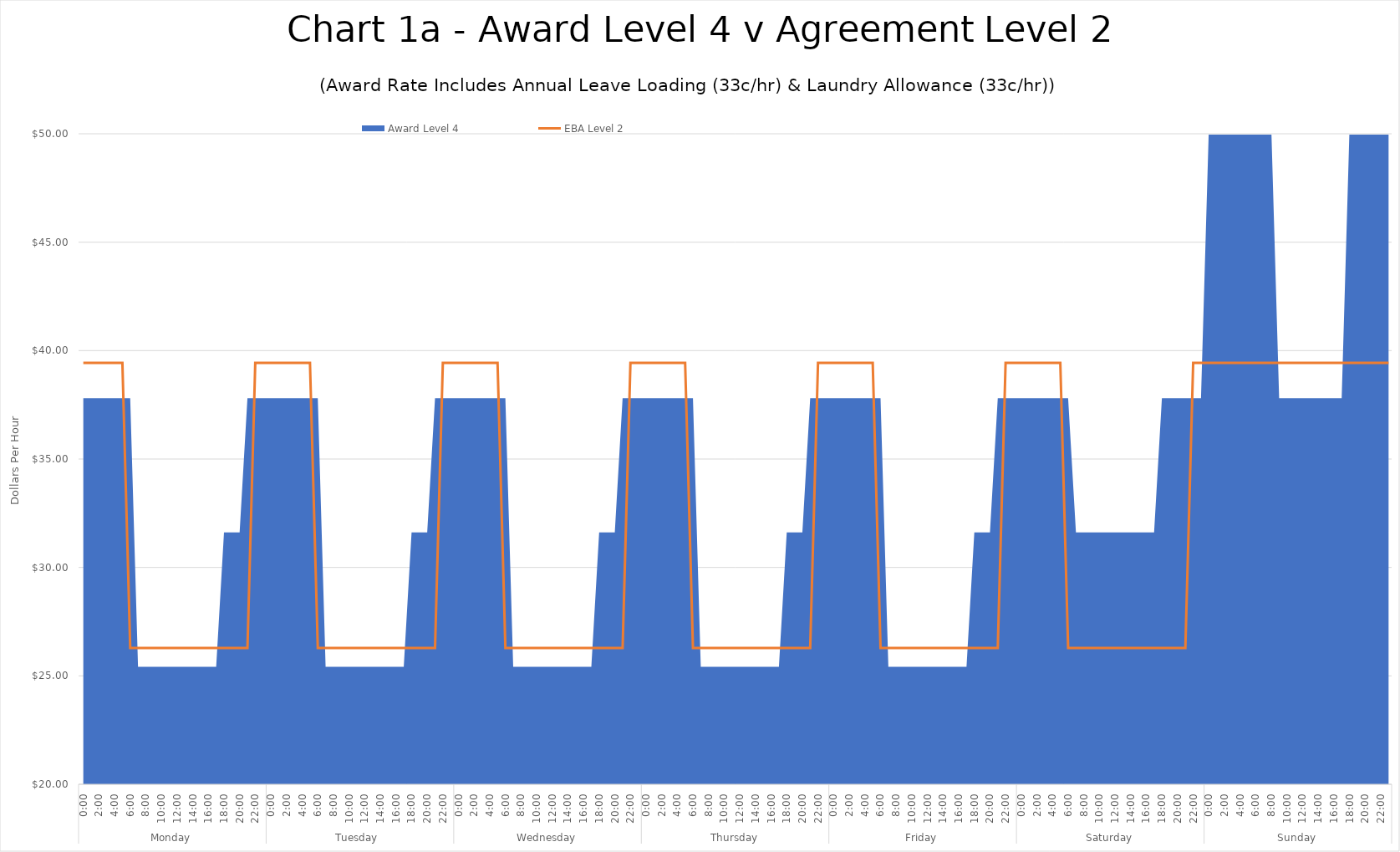
| Category | EBA Level 2 |
|---|---|
| 0 | 39.435 |
| 1 | 39.435 |
| 2 | 39.435 |
| 3 | 39.435 |
| 4 | 39.435 |
| 5 | 39.435 |
| 6 | 26.29 |
| 7 | 26.29 |
| 8 | 26.29 |
| 9 | 26.29 |
| 10 | 26.29 |
| 11 | 26.29 |
| 12 | 26.29 |
| 13 | 26.29 |
| 14 | 26.29 |
| 15 | 26.29 |
| 16 | 26.29 |
| 17 | 26.29 |
| 18 | 26.29 |
| 19 | 26.29 |
| 20 | 26.29 |
| 21 | 26.29 |
| 22 | 39.435 |
| 23 | 39.435 |
| 24 | 39.435 |
| 25 | 39.435 |
| 26 | 39.435 |
| 27 | 39.435 |
| 28 | 39.435 |
| 29 | 39.435 |
| 30 | 26.29 |
| 31 | 26.29 |
| 32 | 26.29 |
| 33 | 26.29 |
| 34 | 26.29 |
| 35 | 26.29 |
| 36 | 26.29 |
| 37 | 26.29 |
| 38 | 26.29 |
| 39 | 26.29 |
| 40 | 26.29 |
| 41 | 26.29 |
| 42 | 26.29 |
| 43 | 26.29 |
| 44 | 26.29 |
| 45 | 26.29 |
| 46 | 39.435 |
| 47 | 39.435 |
| 48 | 39.435 |
| 49 | 39.435 |
| 50 | 39.435 |
| 51 | 39.435 |
| 52 | 39.435 |
| 53 | 39.435 |
| 54 | 26.29 |
| 55 | 26.29 |
| 56 | 26.29 |
| 57 | 26.29 |
| 58 | 26.29 |
| 59 | 26.29 |
| 60 | 26.29 |
| 61 | 26.29 |
| 62 | 26.29 |
| 63 | 26.29 |
| 64 | 26.29 |
| 65 | 26.29 |
| 66 | 26.29 |
| 67 | 26.29 |
| 68 | 26.29 |
| 69 | 26.29 |
| 70 | 39.435 |
| 71 | 39.435 |
| 72 | 39.435 |
| 73 | 39.435 |
| 74 | 39.435 |
| 75 | 39.435 |
| 76 | 39.435 |
| 77 | 39.435 |
| 78 | 26.29 |
| 79 | 26.29 |
| 80 | 26.29 |
| 81 | 26.29 |
| 82 | 26.29 |
| 83 | 26.29 |
| 84 | 26.29 |
| 85 | 26.29 |
| 86 | 26.29 |
| 87 | 26.29 |
| 88 | 26.29 |
| 89 | 26.29 |
| 90 | 26.29 |
| 91 | 26.29 |
| 92 | 26.29 |
| 93 | 26.29 |
| 94 | 39.435 |
| 95 | 39.435 |
| 96 | 39.435 |
| 97 | 39.435 |
| 98 | 39.435 |
| 99 | 39.435 |
| 100 | 39.435 |
| 101 | 39.435 |
| 102 | 26.29 |
| 103 | 26.29 |
| 104 | 26.29 |
| 105 | 26.29 |
| 106 | 26.29 |
| 107 | 26.29 |
| 108 | 26.29 |
| 109 | 26.29 |
| 110 | 26.29 |
| 111 | 26.29 |
| 112 | 26.29 |
| 113 | 26.29 |
| 114 | 26.29 |
| 115 | 26.29 |
| 116 | 26.29 |
| 117 | 26.29 |
| 118 | 39.435 |
| 119 | 39.435 |
| 120 | 39.435 |
| 121 | 39.435 |
| 122 | 39.435 |
| 123 | 39.435 |
| 124 | 39.435 |
| 125 | 39.435 |
| 126 | 26.29 |
| 127 | 26.29 |
| 128 | 26.29 |
| 129 | 26.29 |
| 130 | 26.29 |
| 131 | 26.29 |
| 132 | 26.29 |
| 133 | 26.29 |
| 134 | 26.29 |
| 135 | 26.29 |
| 136 | 26.29 |
| 137 | 26.29 |
| 138 | 26.29 |
| 139 | 26.29 |
| 140 | 26.29 |
| 141 | 26.29 |
| 142 | 39.435 |
| 143 | 39.435 |
| 144 | 39.435 |
| 145 | 39.435 |
| 146 | 39.435 |
| 147 | 39.435 |
| 148 | 39.435 |
| 149 | 39.435 |
| 150 | 39.435 |
| 151 | 39.435 |
| 152 | 39.435 |
| 153 | 39.435 |
| 154 | 39.435 |
| 155 | 39.435 |
| 156 | 39.435 |
| 157 | 39.435 |
| 158 | 39.435 |
| 159 | 39.435 |
| 160 | 39.435 |
| 161 | 39.435 |
| 162 | 39.435 |
| 163 | 39.435 |
| 164 | 39.435 |
| 165 | 39.435 |
| 166 | 39.435 |
| 167 | 39.435 |